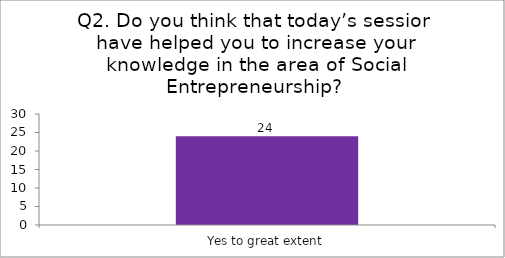
| Category | Q2. Do you think that today’s session have helped you to increase your knowledge in the area of Social Entrepreneurship? |
|---|---|
| Yes to great extent | 24 |